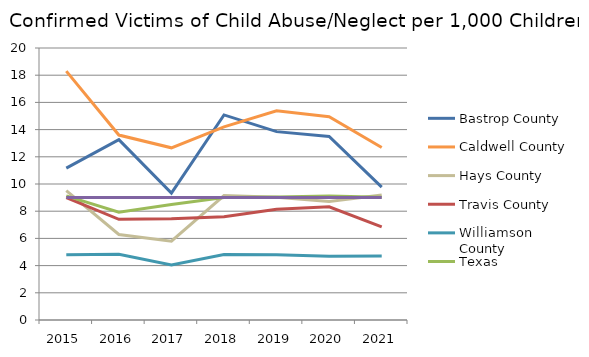
| Category | Bastrop County | Caldwell County | Hays County | Travis County | Williamson County | Texas | USA |
|---|---|---|---|---|---|---|---|
| 2015.0 | 11.17 | 18.3 | 9.52 | 8.99 | 4.79 | 9.13 | 9 |
| 2016.0 | 13.26 | 13.6 | 6.29 | 7.4 | 4.83 | 7.92 | 9 |
| 2017.0 | 9.33 | 12.66 | 5.79 | 7.45 | 4.05 | 8.49 | 9 |
| 2018.0 | 15.08 | 14.2 | 9.15 | 7.59 | 4.81 | 9.01 | 9 |
| 2019.0 | 13.85 | 15.38 | 9.02 | 8.14 | 4.79 | 9.05 | 9 |
| 2020.0 | 13.5 | 14.95 | 8.72 | 8.32 | 4.68 | 9.11 | 9 |
| 2021.0 | 9.77 | 12.68 | 9.19 | 6.85 | 4.7 | 9.02 | 9 |